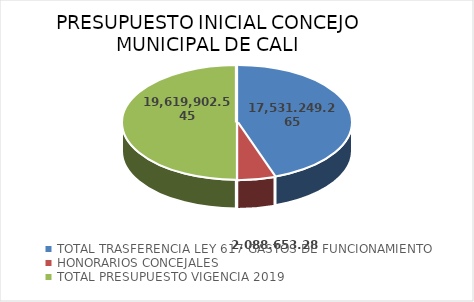
| Category | PRESUPUESTO INICIAL  | Series 1 |
|---|---|---|
| TOTAL TRASFERENCIA LEY 617 GASTOS DE FUNCIONAMIENTO  | 17531249265 | 17531249265 |
| HONORARIOS CONCEJALES  | 2088653280 | 2088653280 |
| TOTAL PRESUPUESTO VIGENCIA 2019  | 19619902545 | 19619902545 |